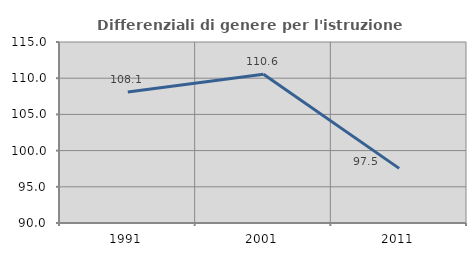
| Category | Differenziali di genere per l'istruzione superiore |
|---|---|
| 1991.0 | 108.102 |
| 2001.0 | 110.557 |
| 2011.0 | 97.546 |